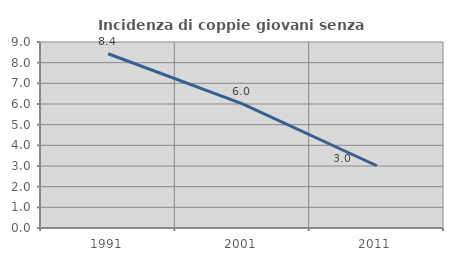
| Category | Incidenza di coppie giovani senza figli |
|---|---|
| 1991.0 | 8.432 |
| 2001.0 | 6.003 |
| 2011.0 | 3.012 |